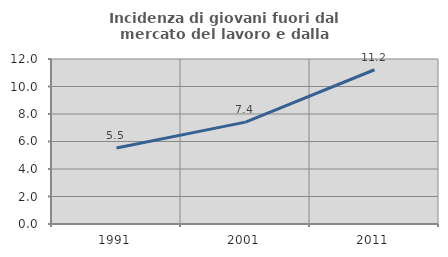
| Category | Incidenza di giovani fuori dal mercato del lavoro e dalla formazione  |
|---|---|
| 1991.0 | 5.523 |
| 2001.0 | 7.407 |
| 2011.0 | 11.218 |